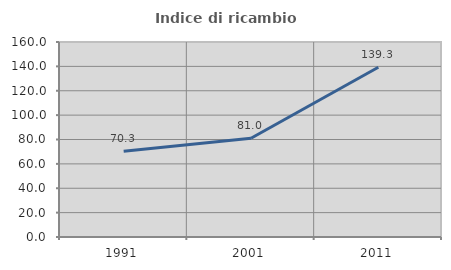
| Category | Indice di ricambio occupazionale  |
|---|---|
| 1991.0 | 70.286 |
| 2001.0 | 81.006 |
| 2011.0 | 139.286 |